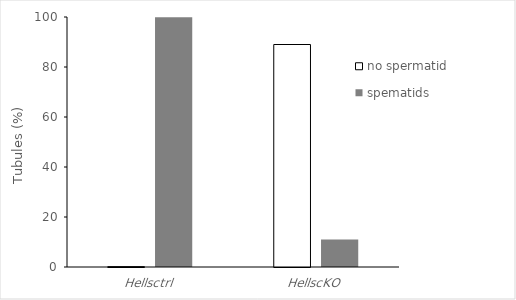
| Category | no spermatid | spematids |
|---|---|---|
| Hellsctrl | 0.142 | 99.858 |
| HellscKO | 88.999 | 11.001 |